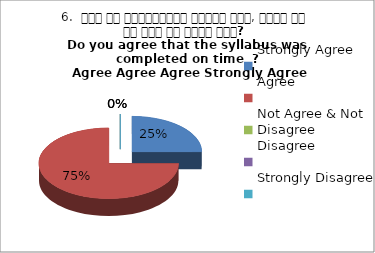
| Category | 6.  समय पर पाठ्यक्रम पूर्ण हुआ, क्या आप इस बात से सहमत हैं? 
Do you agree that the syllabus was completed on time  ?
 Agree Agree Agree Strongly Agree Agree |
|---|---|
| Strongly Agree | 1 |
| Agree | 3 |
| Not Agree & Not Disagree | 0 |
| Disagree | 0 |
| Strongly Disagree | 0 |